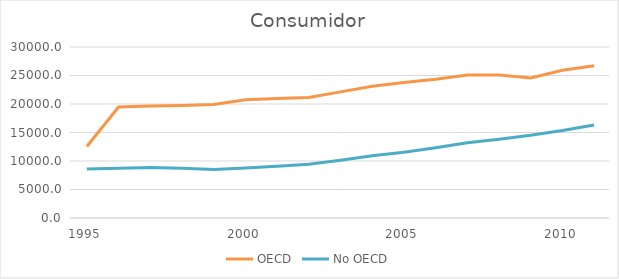
| Category | OECD | No OECD |
|---|---|---|
| 1995.0 | 12554.974 | 8575.907 |
| 1996.0 | 19470.29 | 8739.155 |
| 1997.0 | 19638.378 | 8842.168 |
| 1998.0 | 19755.795 | 8726.354 |
| 1999.0 | 19896.045 | 8518.248 |
| 2000.0 | 20758.575 | 8769.577 |
| 2001.0 | 20967.217 | 9059.938 |
| 2002.0 | 21146.523 | 9418.842 |
| 2003.0 | 22127.577 | 10118.317 |
| 2004.0 | 23120.441 | 10910.526 |
| 2005.0 | 23776.763 | 11547.734 |
| 2006.0 | 24356.03 | 12309.082 |
| 2007.0 | 25098.985 | 13194.602 |
| 2008.0 | 25071.947 | 13804.569 |
| 2009.0 | 24584.157 | 14499.115 |
| 2010.0 | 25918.886 | 15338.745 |
| 2011.0 | 26701.258 | 16307.81 |